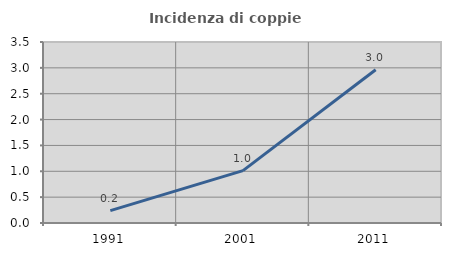
| Category | Incidenza di coppie miste |
|---|---|
| 1991.0 | 0.239 |
| 2001.0 | 1.013 |
| 2011.0 | 2.965 |